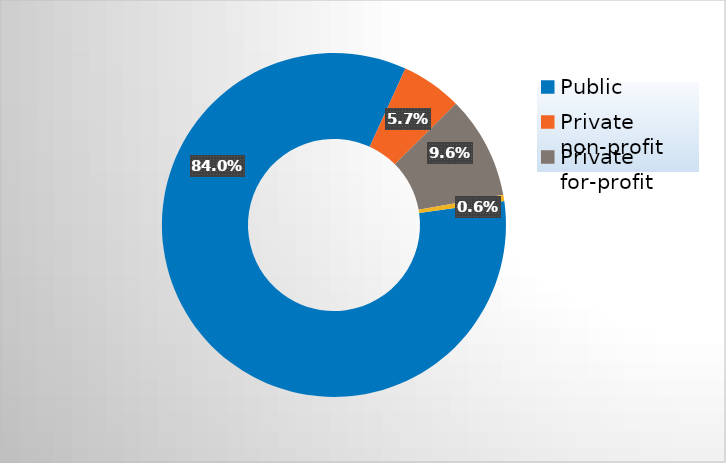
| Category | Series 0 |
|---|---|
| Public | 0.84 |
| Private non-profit | 0.057 |
| Private for-profit | 0.096 |
| Private, state-related | 0.006 |